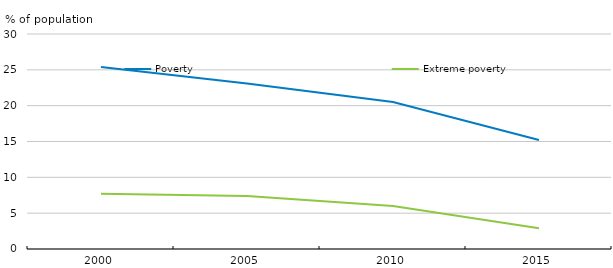
| Category | Poverty | Extreme poverty |
|---|---|---|
| 2000.0 | 25.4 | 7.7 |
| 2005.0 | 23.1 | 7.4 |
| 2010.0 | 20.5 | 6 |
| 2015.0 | 15.2 | 2.9 |